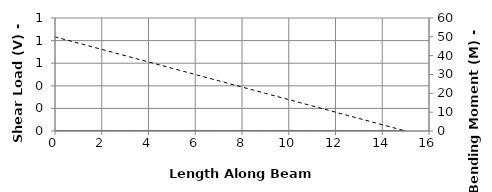
| Category | V |
|---|---|
| 0.0 | 0 |
| 0.0 | 0 |
| 1e-05 | 0 |
| 0.5 | 0 |
| 1.0 | 0 |
| 1.5 | 0 |
| 2.0 | 0 |
| 2.5 | 0 |
| 3.0 | 0 |
| 3.5 | 0 |
| 4.0 | 0 |
| 4.5 | 0 |
| 5.0 | 0 |
| 5.5 | 0 |
| 6.0 | 0 |
| 6.5 | 0 |
| 7.0 | 0 |
| 7.5 | 0 |
| 8.0 | 0 |
| 8.5 | 0 |
| 9.0 | 0 |
| 9.5 | 0 |
| 10.0 | 0 |
| 10.5 | 0 |
| 11.0 | 0 |
| 11.5 | 0 |
| 12.0 | 0 |
| 12.5 | 0 |
| 13.0 | 0 |
| 13.5 | 0 |
| 14.0 | 0 |
| 14.5 | 0 |
| 15.0 | 0 |
| 15.0 | 0 |